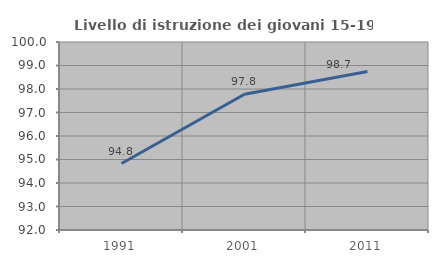
| Category | Livello di istruzione dei giovani 15-19 anni |
|---|---|
| 1991.0 | 94.828 |
| 2001.0 | 97.778 |
| 2011.0 | 98.742 |